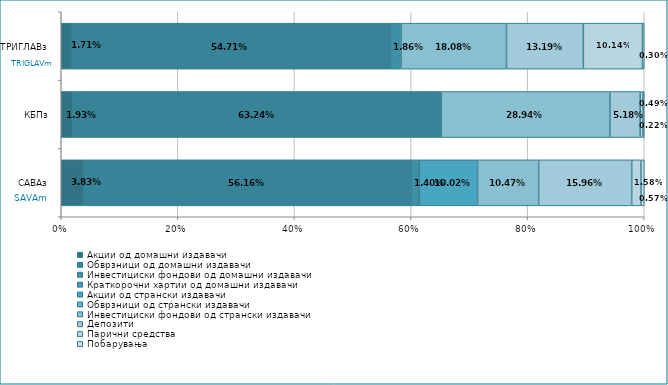
| Category | Акции од домашни издавачи  | Обврзници од домашни издавачи  | Инвестициски фондови од домашни издавачи  | Краткорочни хартии од домашни издавачи  | Акции од странски издавачи  | Обврзници од странски издавачи  | Инвестициски фондови од странски издавaчи | Депозити  | Парични средства  | Побарувања |
|---|---|---|---|---|---|---|---|---|---|---|
| САВАз | 0.038 | 0.562 | 0.014 | 0 | 0.1 | 0 | 0.105 | 0.16 | 0.016 | 0.006 |
| КБПз | 0.019 | 0.632 | 0 | 0 | 0 | 0 | 0.289 | 0.052 | 0.005 | 0.002 |
| ТРИГЛАВз | 0.017 | 0.547 | 0.019 | 0 | 0 | 0 | 0.181 | 0.132 | 0.101 | 0.003 |